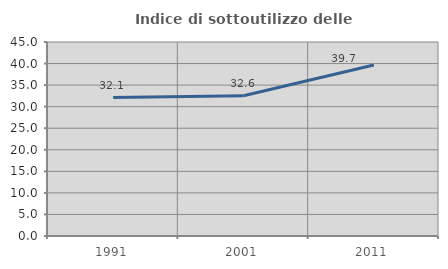
| Category | Indice di sottoutilizzo delle abitazioni  |
|---|---|
| 1991.0 | 32.109 |
| 2001.0 | 32.552 |
| 2011.0 | 39.664 |